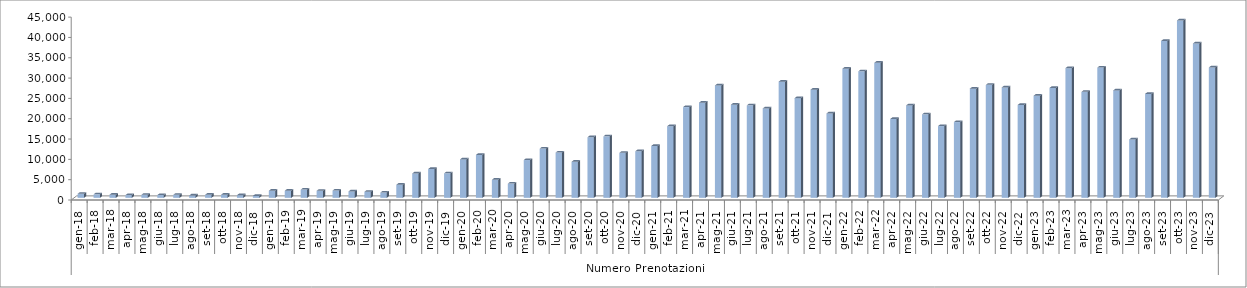
| Category | Series 0 |
|---|---|
| 0 | 996 |
| 1900-01-01 | 849 |
| 1900-01-02 | 765 |
| 1900-01-03 | 668 |
| 1900-01-04 | 737 |
| 1900-01-05 | 673 |
| 1900-01-06 | 732 |
| 1900-01-07 | 570 |
| 1900-01-08 | 752 |
| 1900-01-09 | 752 |
| 1900-01-10 | 648 |
| 1900-01-11 | 466 |
| 1900-01-12 | 1741 |
| 1900-01-13 | 1745 |
| 1900-01-14 | 2021 |
| 1900-01-15 | 1730 |
| 1900-01-16 | 1790 |
| 1900-01-17 | 1559 |
| 1900-01-18 | 1484 |
| 1900-01-19 | 1293 |
| 1900-01-20 | 3217 |
| 1900-01-21 | 5987 |
| 1900-01-22 | 7090 |
| 1900-01-23 | 6030 |
| 1900-01-24 | 9451 |
| 1900-01-25 | 10561 |
| 1900-01-26 | 4442 |
| 1900-01-27 | 3496 |
| 1900-01-28 | 9296 |
| 1900-01-29 | 12120 |
| 1900-01-30 | 11135 |
| 1900-01-31 | 8877 |
| 1900-02-01 | 14903 |
| 1900-02-02 | 15123 |
| 1900-02-03 | 11075 |
| 1900-02-04 | 11456 |
| 1900-02-05 | 12756 |
| 1900-02-06 | 17612 |
| 1900-02-07 | 22323 |
| 1900-02-08 | 23401 |
| 1900-02-09 | 27652 |
| 1900-02-10 | 22918 |
| 1900-02-11 | 22750 |
| 1900-02-12 | 21988 |
| 1900-02-13 | 28587 |
| 1900-02-14 | 24526 |
| 1900-02-15 | 26608 |
| 1900-02-16 | 20755 |
| 1900-02-17 | 31777 |
| 1900-02-18 | 31128 |
| 1900-02-19 | 33234 |
| 1900-02-20 | 19395 |
| 1900-02-21 | 22731 |
| 1900-02-22 | 20543 |
| 1900-02-23 | 17657 |
| 1900-02-24 | 18639 |
| 1900-02-25 | 26870 |
| 1900-02-26 | 27796 |
| 1900-02-27 | 27163 |
| 1900-02-28 | 22847 |
| 1900-02-28 | 25133 |
| 1900-03-01 | 27034 |
| 1900-03-02 | 31908 |
| 1900-03-03 | 26073 |
| 1900-03-04 | 32052 |
| 1900-03-05 | 26434 |
| 1900-03-06 | 14356 |
| 1900-03-07 | 25574 |
| 1900-03-08 | 38589 |
| 1900-03-09 | 43658 |
| 1900-03-10 | 37985 |
| 1900-03-11 | 32076 |